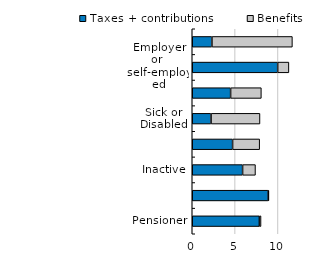
| Category | Taxes + contributions | Benefits |
|---|---|---|
| Pensioner | 7.83 | 0.195 |
| Employee | 8.858 | 0.088 |
| Inactive | 5.875 | 1.502 |
| Other | 4.707 | 3.16 |
| Sick or Disabled | 2.193 | 5.707 |
| Student | 4.475 | 3.586 |
| Employer or 
self-employed | 9.969 | 1.307 |
| Unemployed | 2.296 | 9.388 |